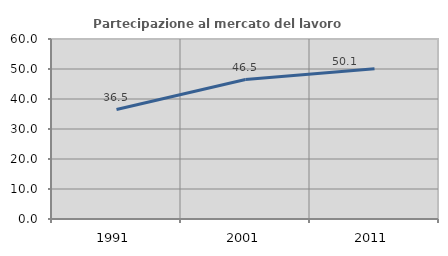
| Category | Partecipazione al mercato del lavoro  femminile |
|---|---|
| 1991.0 | 36.473 |
| 2001.0 | 46.481 |
| 2011.0 | 50.099 |